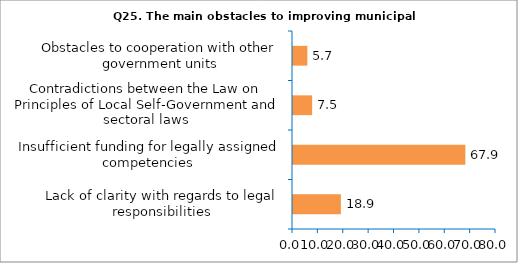
| Category | Series 0 |
|---|---|
| Lack of clarity with regards to legal responsibilities | 18.868 |
| Insufficient funding for legally assigned competencies | 67.925 |
| Contradictions between the Law on Principles of Local Self-Government and sectoral laws | 7.547 |
| Obstacles to cooperation with other government units | 5.66 |